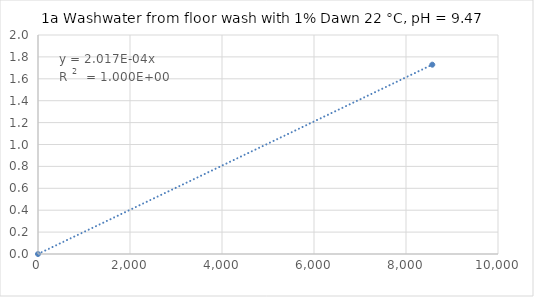
| Category | Series 0 |
|---|---|
| 0.0 | 0 |
| 8571.428571428572 | 1.729 |